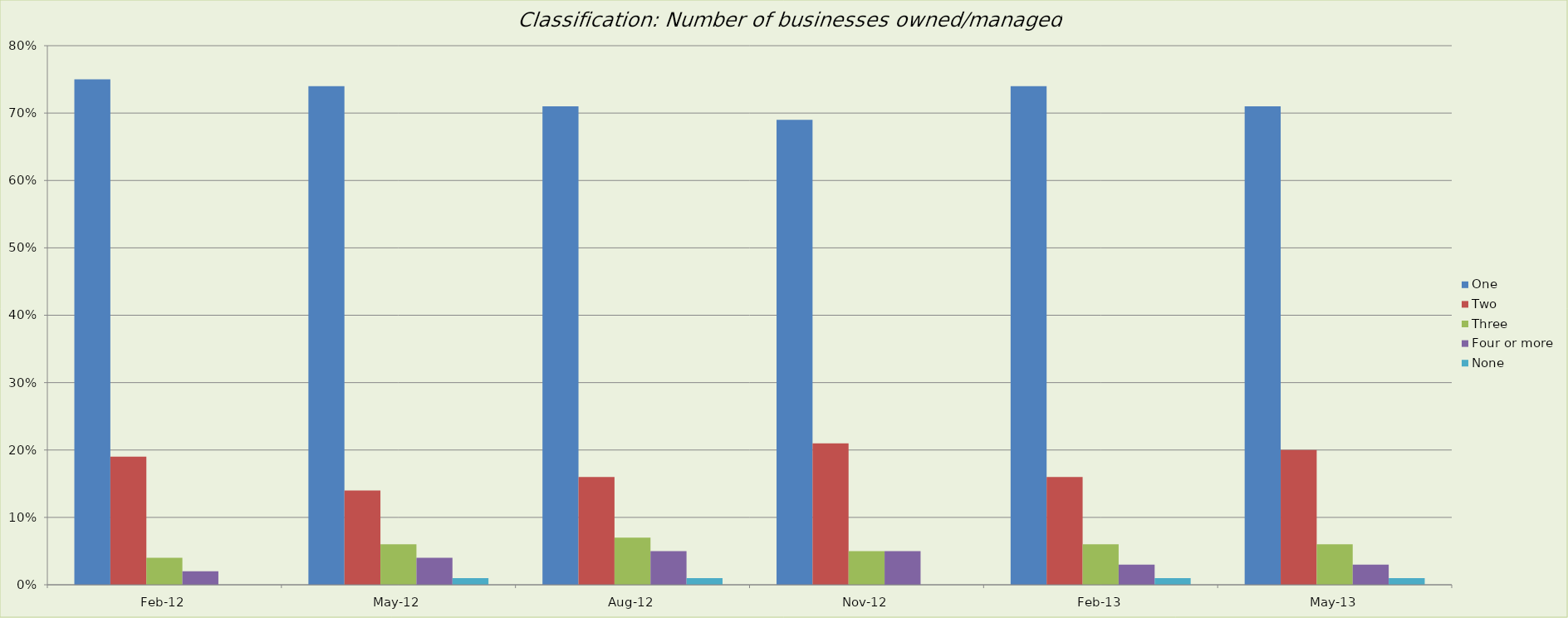
| Category | One | Two | Three | Four or more | None |
|---|---|---|---|---|---|
| 2012-02-01 | 0.75 | 0.19 | 0.04 | 0.02 | 0 |
| 2012-05-01 | 0.74 | 0.14 | 0.06 | 0.04 | 0.01 |
| 2012-08-01 | 0.71 | 0.16 | 0.07 | 0.05 | 0.01 |
| 2012-11-01 | 0.69 | 0.21 | 0.05 | 0.05 | 0 |
| 2013-02-01 | 0.74 | 0.16 | 0.06 | 0.03 | 0.01 |
| 2013-05-01 | 0.71 | 0.2 | 0.06 | 0.03 | 0.01 |